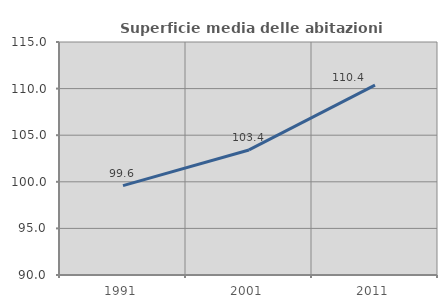
| Category | Superficie media delle abitazioni occupate |
|---|---|
| 1991.0 | 99.59 |
| 2001.0 | 103.419 |
| 2011.0 | 110.374 |